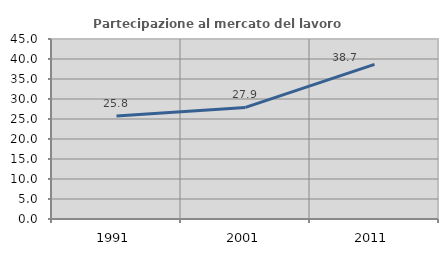
| Category | Partecipazione al mercato del lavoro  femminile |
|---|---|
| 1991.0 | 25.763 |
| 2001.0 | 27.897 |
| 2011.0 | 38.659 |